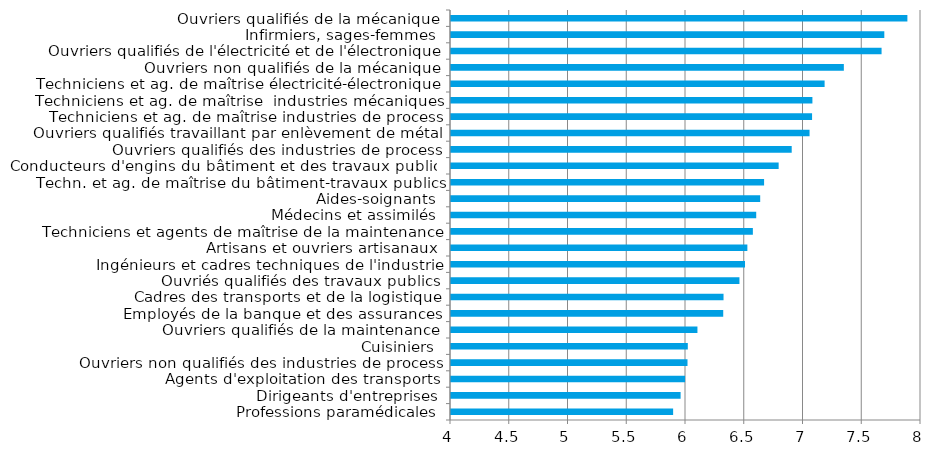
| Category | Series 0 |
|---|---|
| Professions paramédicales | 5.89 |
| Dirigeants d'entreprises | 5.954 |
| Agents d'exploitation des transports | 5.992 |
| Ouvriers non qualifiés des industries de process | 6.013 |
| Cuisiniers | 6.015 |
| Ouvriers qualifiés de la maintenance | 6.097 |
| Employés de la banque et des assurances | 6.317 |
| Cadres des transports et de la logistique | 6.319 |
| Ouvriés qualifiés des travaux publics | 6.455 |
| Ingénieurs et cadres techniques de l'industrie | 6.502 |
| Artisans et ouvriers artisanaux | 6.522 |
| Techniciens et agents de maîtrise de la maintenance | 6.569 |
| Médecins et assimilés | 6.598 |
| Aides-soignants | 6.631 |
| Techn. et ag. de maîtrise du bâtiment-travaux publics | 6.665 |
| Conducteurs d'engins du bâtiment et des travaux publics | 6.789 |
| Ouvriers qualifiés des industries de process | 6.9 |
| Ouvriers qualifiés travaillant par enlèvement de métal | 7.052 |
| Techniciens et ag. de maîtrise industries de process | 7.073 |
| Techniciens et ag. de maîtrise  industries mécaniques | 7.076 |
| Techniciens et ag. de maîtrise électricité-électronique | 7.18 |
| Ouvriers non qualifiés de la mécanique | 7.343 |
| Ouvriers qualifiés de l'électricité et de l'électronique | 7.664 |
| Infirmiers, sages-femmes | 7.688 |
| Ouvriers qualifiés de la mécanique | 7.884 |